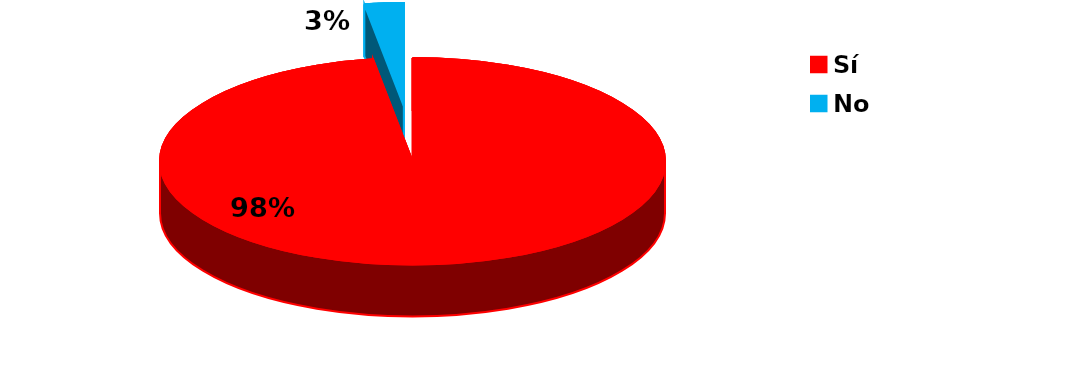
| Category | Series 0 |
|---|---|
| Sí | 39 |
| No | 1 |